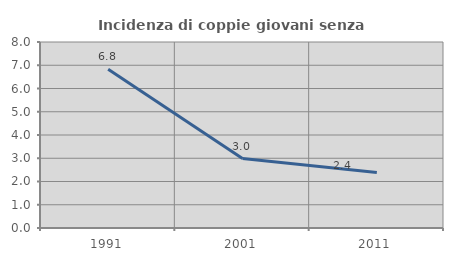
| Category | Incidenza di coppie giovani senza figli |
|---|---|
| 1991.0 | 6.824 |
| 2001.0 | 2.989 |
| 2011.0 | 2.388 |